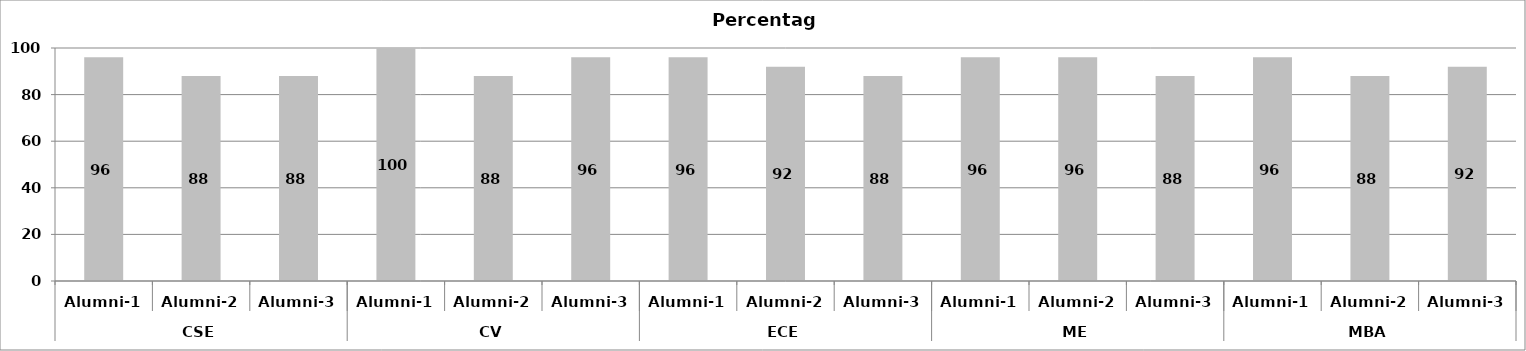
| Category | Percentage |
|---|---|
| 0 | 96 |
| 1 | 88 |
| 2 | 88 |
| 3 | 100 |
| 4 | 88 |
| 5 | 96 |
| 6 | 96 |
| 7 | 92 |
| 8 | 88 |
| 9 | 96 |
| 10 | 96 |
| 11 | 88 |
| 12 | 96 |
| 13 | 88 |
| 14 | 92 |